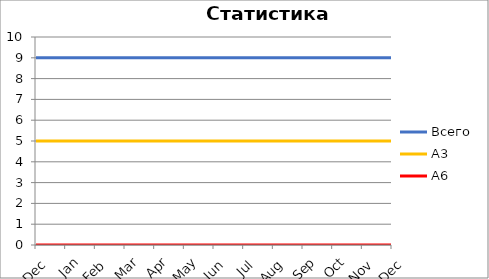
| Category | Всего | А3 | A6 |
|---|---|---|---|
| 0 | 9 | 5 | 0 |
| 1 | 9 | 5 | 0 |
| 2 | 9 | 5 | 0 |
| 3 | 9 | 5 | 0 |
| 4 | 9 | 5 | 0 |
| 5 | 9 | 5 | 0 |
| 6 | 9 | 5 | 0 |
| 7 | 9 | 5 | 0 |
| 8 | 9 | 5 | 0 |
| 9 | 9 | 5 | 0 |
| 10 | 9 | 5 | 0 |
| 11 | 9 | 5 | 0 |
| 12 | 9 | 5 | 0 |